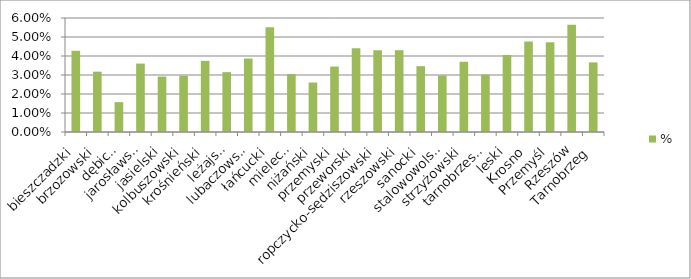
| Category | Ludność | Ogółem | % |
|---|---|---|---|
| bieszczadzki |  |  | 0.043 |
| brzozowski |  |  | 0.032 |
| dębicki |  |  | 0.016 |
| jarosławski |  |  | 0.036 |
| jasielski |  |  | 0.029 |
| kolbuszowski |  |  | 0.03 |
| krośnieński |  |  | 0.037 |
| leżajski |  |  | 0.032 |
| lubaczowski |  |  | 0.039 |
| łańcucki |  |  | 0.055 |
| mielecki |  |  | 0.031 |
| niżański |  |  | 0.026 |
| przemyski |  |  | 0.034 |
| przeworski |  |  | 0.044 |
| ropczycko-sędziszowski |  |  | 0.043 |
| rzeszowski |  |  | 0.043 |
| sanocki |  |  | 0.035 |
| stalowowolski |  |  | 0.03 |
| strzyżowski |  |  | 0.037 |
| tarnobrzeski |  |  | 0.03 |
| leski |  |  | 0.041 |
| Krosno |  |  | 0.048 |
| Przemyśl |  |  | 0.047 |
| Rzeszów |  |  | 0.056 |
| Tarnobrzeg |  |  | 0.037 |